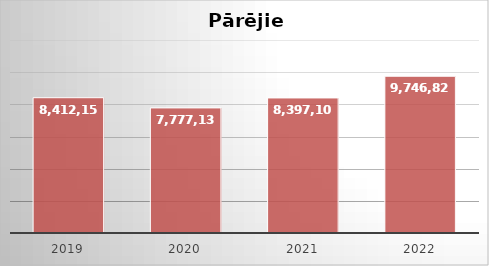
| Category | Series 0 |
|---|---|
| 2019.0 | 8412150 |
| 2020.0 | 7777139 |
| 2021.0 | 8397102 |
| 2022.0 | 9746826 |